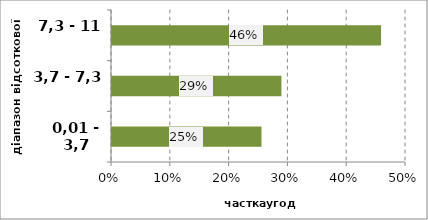
| Category | Series 0 |
|---|---|
| 0,01 - 3,7 | 0.254 |
| 3,7 - 7,3 | 0.288 |
| 7,3 - 11 | 0.458 |